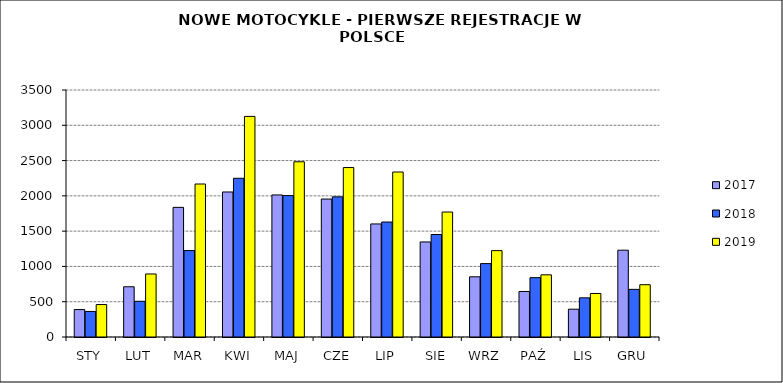
| Category | 2017 | 2018 | 2019 |
|---|---|---|---|
|  STY  | 389 | 362 | 460 |
|  LUT  | 712 | 506 | 893 |
| MAR | 1837 | 1225 | 2168 |
| KWI | 2055 | 2249 | 3126 |
| MAJ | 2013 | 2004 | 2483 |
| CZE | 1955 | 1986 | 2401 |
| LIP | 1602 | 1629 | 2338 |
| SIE | 1347 | 1452 | 1771 |
| WRZ | 853 | 1040 | 1224 |
| PAŹ | 645 | 841 | 881 |
| LIS | 394 | 555 | 617 |
| GRU | 1230 | 675 | 741 |